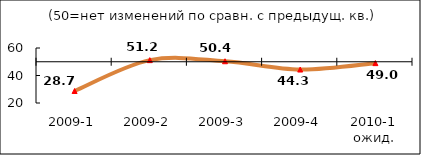
| Category | Диф.индекс ↓ |
|---|---|
| 2009-1 | 28.72 |
| 2009-2 | 51.18 |
| 2009-3 | 50.375 |
| 2009-4 | 44.335 |
| 2010-1 ожид. | 48.99 |